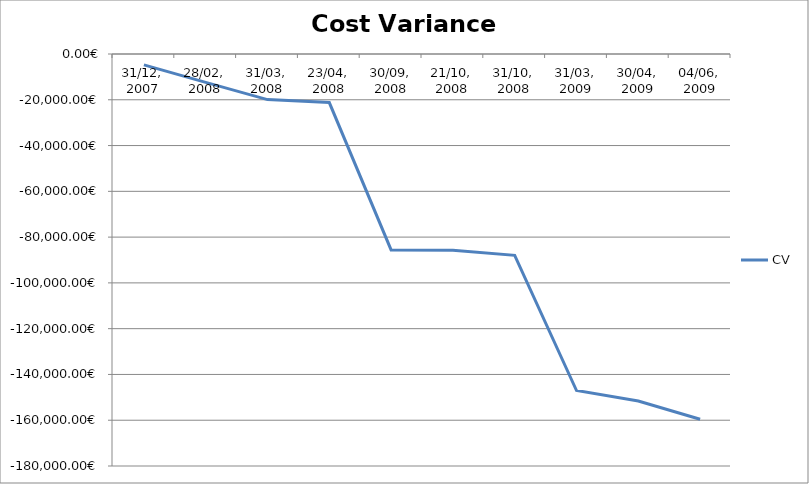
| Category | CV |
|---|---|
| 31/12, 2007 | -4761.62 |
| 28/02, 2008 | -12415.46 |
| 31/03, 2008 | -19909.71 |
| 23/04, 2008 | -21215.52 |
| 30/09, 2008 | -85594.46 |
| 21/10, 2008 | -85746.64 |
| 31/10, 2008 | -87970.609 |
| 31/03, 2009 | -147019.381 |
| 30/04, 2009 | -151639.762 |
| 04/06, 2009 | -159573.272 |